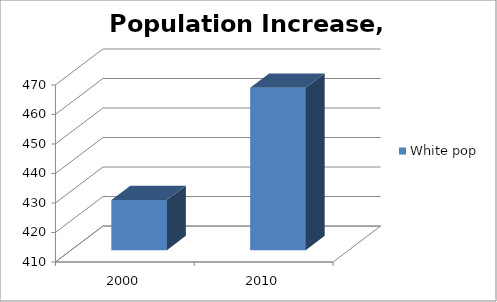
| Category | White pop |
|---|---|
| 2000.0 | 427 |
| 2010.0 | 465 |